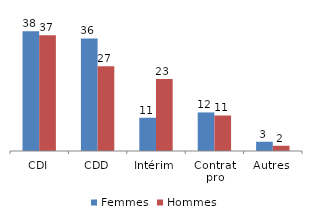
| Category | Femmes | Hommes |
|---|---|---|
| CDI | 38.18 | 36.98 |
| CDD | 35.94 | 27.06 |
| Intérim | 10.61 | 22.96 |
| Contrat
pro | 12.31 | 11.33 |
| Autres | 2.96 | 1.67 |